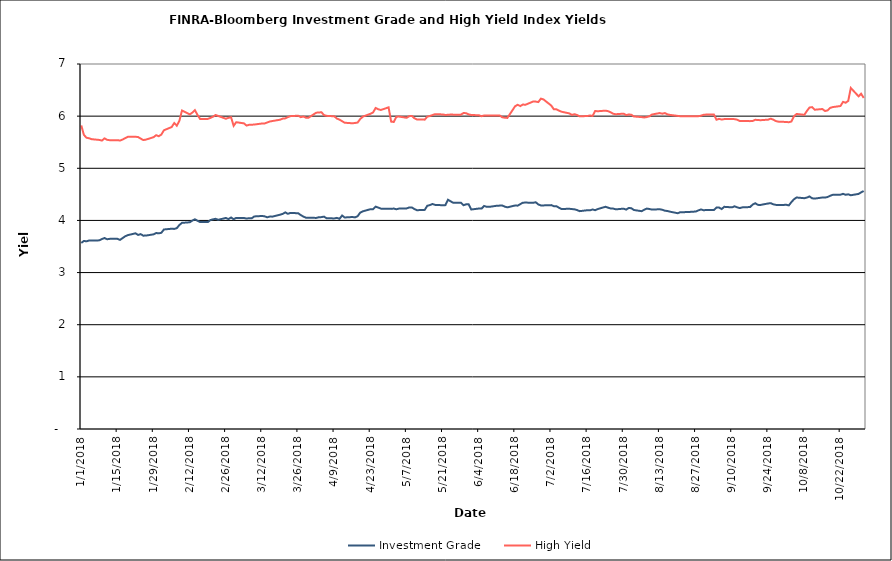
| Category | Investment Grade | High Yield |
|---|---|---|
| 1/1/18 | 3.568 | 5.822 |
| 1/2/18 | 3.606 | 5.641 |
| 1/3/18 | 3.599 | 5.586 |
| 1/4/18 | 3.614 | 5.576 |
| 1/5/18 | 3.614 | 5.558 |
| 1/8/18 | 3.618 | 5.544 |
| 1/9/18 | 3.643 | 5.532 |
| 1/10/18 | 3.663 | 5.574 |
| 1/11/18 | 3.64 | 5.546 |
| 1/12/18 | 3.646 | 5.539 |
| 1/15/18 | 3.646 | 5.539 |
| 1/16/18 | 3.627 | 5.532 |
| 1/17/18 | 3.661 | 5.552 |
| 1/18/18 | 3.696 | 5.579 |
| 1/19/18 | 3.718 | 5.604 |
| 1/22/18 | 3.753 | 5.604 |
| 1/23/18 | 3.722 | 5.599 |
| 1/24/18 | 3.737 | 5.569 |
| 1/25/18 | 3.708 | 5.541 |
| 1/26/18 | 3.709 | 5.549 |
| 1/29/18 | 3.733 | 5.597 |
| 1/30/18 | 3.759 | 5.635 |
| 1/31/18 | 3.752 | 5.615 |
| 2/1/18 | 3.763 | 5.647 |
| 2/2/18 | 3.826 | 5.729 |
| 2/5/18 | 3.841 | 5.791 |
| 2/6/18 | 3.837 | 5.868 |
| 2/7/18 | 3.852 | 5.817 |
| 2/8/18 | 3.913 | 5.914 |
| 2/9/18 | 3.954 | 6.108 |
| 2/12/18 | 3.965 | 6.033 |
| 2/13/18 | 3.997 | 6.068 |
| 2/14/18 | 4.022 | 6.115 |
| 2/15/18 | 3.994 | 6.024 |
| 2/16/18 | 3.968 | 5.947 |
| 2/19/18 | 3.968 | 5.947 |
| 2/20/18 | 4.007 | 5.966 |
| 2/21/18 | 4.021 | 5.989 |
| 2/22/18 | 4.031 | 6.022 |
| 2/23/18 | 4.012 | 6.004 |
| 2/26/18 | 4.047 | 5.95 |
| 2/27/18 | 4.026 | 5.968 |
| 2/28/18 | 4.056 | 5.979 |
| 3/1/18 | 4.024 | 5.814 |
| 3/2/18 | 4.048 | 5.884 |
| 3/5/18 | 4.048 | 5.861 |
| 3/6/18 | 4.035 | 5.819 |
| 3/7/18 | 4.044 | 5.834 |
| 3/8/18 | 4.042 | 5.836 |
| 3/9/18 | 4.076 | 5.839 |
| 3/12/18 | 4.085 | 5.859 |
| 3/13/18 | 4.079 | 5.86 |
| 3/14/18 | 4.06 | 5.878 |
| 3/15/18 | 4.074 | 5.897 |
| 3/16/18 | 4.073 | 5.906 |
| 3/19/18 | 4.111 | 5.932 |
| 3/20/18 | 4.125 | 5.953 |
| 3/21/18 | 4.154 | 5.958 |
| 3/22/18 | 4.127 | 5.981 |
| 3/23/18 | 4.144 | 6 |
| 3/26/18 | 4.138 | 6.008 |
| 3/27/18 | 4.102 | 5.98 |
| 3/28/18 | 4.074 | 5.993 |
| 3/29/18 | 4.052 | 5.97 |
| 3/30/18 | 4.052 | 5.97 |
| 4/2/18 | 4.048 | 6.067 |
| 4/3/18 | 4.062 | 6.069 |
| 4/4/18 | 4.064 | 6.076 |
| 4/5/18 | 4.073 | 6.018 |
| 4/6/18 | 4.041 | 6.006 |
| 4/9/18 | 4.039 | 5.997 |
| 4/10/18 | 4.049 | 5.953 |
| 4/11/18 | 4.031 | 5.932 |
| 4/12/18 | 4.094 | 5.904 |
| 4/13/18 | 4.056 | 5.874 |
| 4/16/18 | 4.066 | 5.863 |
| 4/17/18 | 4.058 | 5.869 |
| 4/18/18 | 4.081 | 5.877 |
| 4/19/18 | 4.148 | 5.942 |
| 4/20/18 | 4.174 | 5.99 |
| 4/23/18 | 4.216 | 6.045 |
| 4/24/18 | 4.216 | 6.072 |
| 4/25/18 | 4.264 | 6.157 |
| 4/26/18 | 4.247 | 6.132 |
| 4/27/18 | 4.226 | 6.118 |
| 4/30/18 | 4.224 | 6.169 |
| 5/1/18 | 4.222 | 5.895 |
| 5/2/18 | 4.228 | 5.889 |
| 5/3/18 | 4.214 | 5.988 |
| 5/4/18 | 4.227 | 5.992 |
| 5/7/18 | 4.23 | 5.968 |
| 5/8/18 | 4.249 | 6 |
| 5/9/18 | 4.25 | 6.004 |
| 5/10/18 | 4.218 | 5.96 |
| 5/11/18 | 4.196 | 5.936 |
| 5/14/18 | 4.202 | 5.933 |
| 5/15/18 | 4.282 | 5.99 |
| 5/16/18 | 4.294 | 6.003 |
| 5/17/18 | 4.316 | 6.021 |
| 5/18/18 | 4.298 | 6.038 |
| 5/21/18 | 4.291 | 6.032 |
| 5/22/18 | 4.293 | 6.022 |
| 5/23/18 | 4.397 | 6.026 |
| 5/24/18 | 4.367 | 6.03 |
| 5/25/18 | 4.34 | 6.029 |
| 5/28/18 | 4.34 | 6.029 |
| 5/29/18 | 4.292 | 6.059 |
| 5/30/18 | 4.308 | 6.057 |
| 5/31/18 | 4.31 | 6.034 |
| 6/1/18 | 4.209 | 6.022 |
| 6/4/18 | 4.228 | 6.017 |
| 6/5/18 | 4.228 | 5.999 |
| 6/6/18 | 4.277 | 6.012 |
| 6/7/18 | 4.261 | 6.013 |
| 6/8/18 | 4.26 | 6.014 |
| 6/11/18 | 4.282 | 6.01 |
| 6/12/18 | 4.284 | 6.014 |
| 6/13/18 | 4.286 | 5.979 |
| 6/14/18 | 4.264 | 5.97 |
| 6/15/18 | 4.251 | 5.966 |
| 6/18/18 | 4.287 | 6.19 |
| 6/19/18 | 4.283 | 6.218 |
| 6/20/18 | 4.312 | 6.193 |
| 6/21/18 | 4.34 | 6.222 |
| 6/22/18 | 4.342 | 6.218 |
| 6/25/18 | 4.339 | 6.28 |
| 6/26/18 | 4.348 | 6.279 |
| 6/27/18 | 4.306 | 6.27 |
| 6/28/18 | 4.287 | 6.336 |
| 6/29/18 | 4.288 | 6.32 |
| 7/2/18 | 4.294 | 6.203 |
| 7/3/18 | 4.273 | 6.131 |
| 7/4/18 | 4.273 | 6.131 |
| 7/5/18 | 4.243 | 6.106 |
| 7/6/18 | 4.219 | 6.085 |
| 7/9/18 | 4.224 | 6.052 |
| 7/10/18 | 4.218 | 6.023 |
| 7/11/18 | 4.213 | 6.037 |
| 7/12/18 | 4.199 | 6.022 |
| 7/13/18 | 4.178 | 5.996 |
| 7/16/18 | 4.196 | 6.003 |
| 7/17/18 | 4.193 | 6.012 |
| 7/18/18 | 4.209 | 6.004 |
| 7/19/18 | 4.197 | 6.099 |
| 7/20/18 | 4.218 | 6.094 |
| 7/23/18 | 4.262 | 6.105 |
| 7/24/18 | 4.245 | 6.095 |
| 7/25/18 | 4.23 | 6.074 |
| 7/26/18 | 4.227 | 6.045 |
| 7/27/18 | 4.213 | 6.037 |
| 7/30/18 | 4.226 | 6.048 |
| 7/31/18 | 4.208 | 6.021 |
| 8/1/18 | 4.238 | 6.032 |
| 8/2/18 | 4.235 | 6.027 |
| 8/3/18 | 4.2 | 5.994 |
| 8/6/18 | 4.177 | 5.981 |
| 8/7/18 | 4.204 | 5.975 |
| 8/8/18 | 4.228 | 5.982 |
| 8/9/18 | 4.219 | 5.998 |
| 8/10/18 | 4.209 | 6.031 |
| 8/13/18 | 4.214 | 6.059 |
| 8/14/18 | 4.205 | 6.047 |
| 8/15/18 | 4.186 | 6.059 |
| 8/16/18 | 4.181 | 6.034 |
| 8/17/18 | 4.168 | 6.023 |
| 8/20/18 | 4.138 | 6.004 |
| 8/21/18 | 4.159 | 5.998 |
| 8/22/18 | 4.158 | 5.998 |
| 8/23/18 | 4.16 | 6 |
| 8/24/18 | 4.161 | 5.997 |
| 8/27/18 | 4.171 | 5.999 |
| 8/28/18 | 4.193 | 6 |
| 8/29/18 | 4.211 | 6.008 |
| 8/30/18 | 4.194 | 6.026 |
| 8/31/18 | 4.201 | 6.03 |
| 9/3/18 | 4.201 | 6.03 |
| 9/4/18 | 4.246 | 5.932 |
| 9/5/18 | 4.246 | 5.948 |
| 9/6/18 | 4.219 | 5.935 |
| 9/7/18 | 4.261 | 5.943 |
| 9/10/18 | 4.251 | 5.946 |
| 9/11/18 | 4.271 | 5.942 |
| 9/12/18 | 4.251 | 5.932 |
| 9/13/18 | 4.237 | 5.906 |
| 9/14/18 | 4.25 | 5.908 |
| 9/17/18 | 4.257 | 5.904 |
| 9/18/18 | 4.305 | 5.908 |
| 9/19/18 | 4.33 | 5.93 |
| 9/20/18 | 4.299 | 5.927 |
| 9/21/18 | 4.297 | 5.922 |
| 9/24/18 | 4.325 | 5.933 |
| 9/25/18 | 4.331 | 5.952 |
| 9/26/18 | 4.309 | 5.932 |
| 9/27/18 | 4.298 | 5.905 |
| 9/28/18 | 4.294 | 5.894 |
| 10/1/18 | 4.3 | 5.888 |
| 10/2/18 | 4.288 | 5.883 |
| 10/3/18 | 4.352 | 5.897 |
| 10/4/18 | 4.406 | 5.996 |
| 10/5/18 | 4.44 | 6.042 |
| 10/8/18 | 4.426 | 6.025 |
| 10/9/18 | 4.438 | 6.099 |
| 10/10/18 | 4.46 | 6.165 |
| 10/11/18 | 4.425 | 6.173 |
| 10/12/18 | 4.418 | 6.123 |
| 10/15/18 | 4.44 | 6.136 |
| 10/16/18 | 4.438 | 6.098 |
| 10/17/18 | 4.449 | 6.11 |
| 10/18/18 | 4.473 | 6.158 |
| 10/19/18 | 4.49 | 6.174 |
| 10/22/18 | 4.494 | 6.194 |
| 10/23/18 | 4.509 | 6.274 |
| 10/24/18 | 4.492 | 6.257 |
| 10/25/18 | 4.501 | 6.292 |
| 10/26/18 | 4.483 | 6.54 |
| 10/29/18 | 4.508 | 6.38 |
| 10/30/18 | 4.538 | 6.43 |
| 10/31/18 | 4.564 | 6.349 |